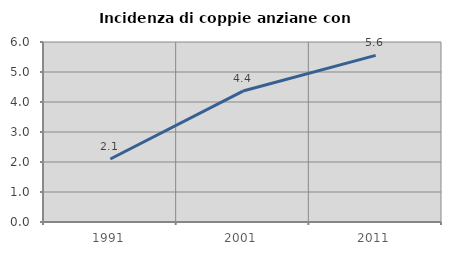
| Category | Incidenza di coppie anziane con figli |
|---|---|
| 1991.0 | 2.101 |
| 2001.0 | 4.365 |
| 2011.0 | 5.556 |